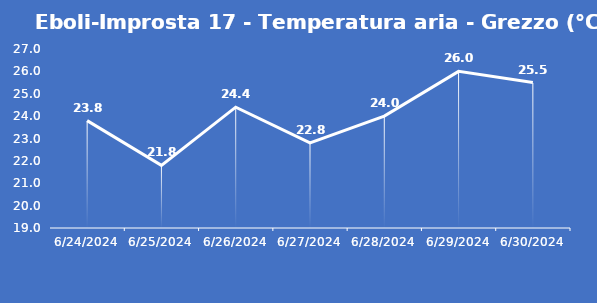
| Category | Eboli-Improsta 17 - Temperatura aria - Grezzo (°C) |
|---|---|
| 6/24/24 | 23.8 |
| 6/25/24 | 21.8 |
| 6/26/24 | 24.4 |
| 6/27/24 | 22.8 |
| 6/28/24 | 24 |
| 6/29/24 | 26 |
| 6/30/24 | 25.5 |